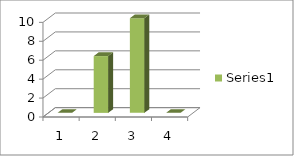
| Category | Series 0 |
|---|---|
| 0 | 0 |
| 1 | 6 |
| 2 | 10 |
| 3 | 0 |